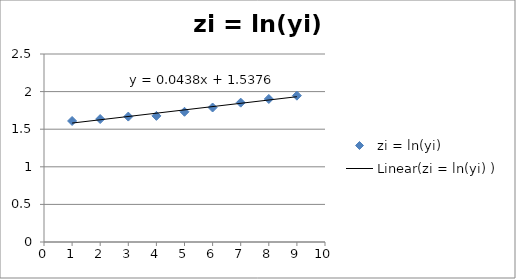
| Category | zi = ln(yi)  |
|---|---|
| 1.0 | 1.609 |
| 2.0 | 1.635 |
| 3.0 | 1.668 |
| 4.0 | 1.677 |
| 5.0 | 1.732 |
| 6.0 | 1.788 |
| 7.0 | 1.853 |
| 8.0 | 1.902 |
| 9.0 | 1.946 |